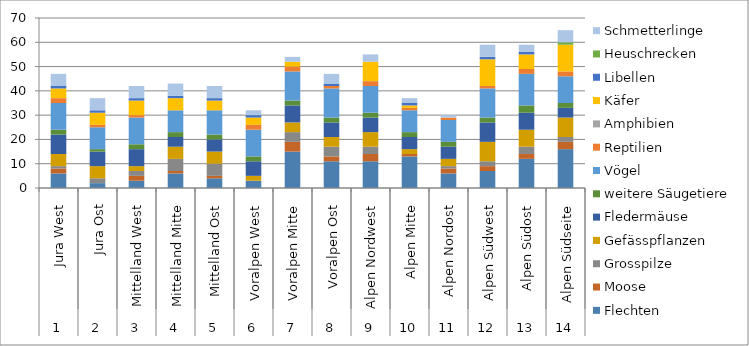
| Category | Flechten | Moose | Grosspilze | Gefässpflanzen | Fledermäuse | weitere Säugetiere | Vögel | Reptilien | Amphibien | Käfer | Libellen | Heuschrecken | Schmetterlinge |
|---|---|---|---|---|---|---|---|---|---|---|---|---|---|
| 0 | 6 | 2 | 1 | 5 | 8 | 2 | 11 | 2 | 0 | 4 | 1 | 0 | 5 |
| 1 | 2 | 0 | 2 | 5 | 6 | 1 | 9 | 1 | 0 | 5 | 1 | 0 | 5 |
| 2 | 3 | 2 | 2 | 2 | 7 | 2 | 11 | 1 | 0 | 6 | 1 | 0 | 5 |
| 3 | 6 | 1 | 5 | 5 | 4 | 2 | 9 | 0 | 0 | 5 | 1 | 0 | 5 |
| 4 | 4 | 1 | 5 | 5 | 5 | 2 | 10 | 0 | 0 | 4 | 1 | 0 | 5 |
| 5 | 3 | 0 | 0 | 2 | 6 | 2 | 11 | 2 | 0 | 3 | 1 | 0 | 2 |
| 6 | 15 | 4 | 4 | 4 | 7 | 2 | 12 | 2 | 0 | 2 | 0 | 0 | 2 |
| 7 | 11 | 2 | 4 | 4 | 6 | 2 | 12 | 1 | 0 | 0 | 1 | 0 | 4 |
| 8 | 11 | 3 | 3 | 6 | 6 | 2 | 11 | 2 | 0 | 8 | 0 | 0 | 3 |
| 9 | 13 | 1 | 0 | 2 | 5 | 2 | 9 | 1 | 0 | 1 | 1 | 0 | 2 |
| 10 | 6 | 2 | 1 | 3 | 5 | 2 | 9 | 1 | 0 | 0 | 0 | 0 | 1 |
| 11 | 7 | 2 | 2 | 8 | 8 | 2 | 12 | 1 | 0 | 11 | 1 | 0 | 5 |
| 12 | 12 | 2 | 3 | 7 | 7 | 3 | 13 | 2 | 0 | 6 | 1 | 0 | 3 |
| 13 | 16 | 3 | 2 | 8 | 4 | 2 | 11 | 2 | 0 | 11 | 0 | 1 | 5 |